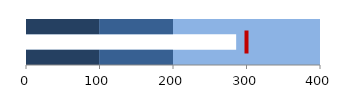
| Category | Series 0 | Series 1 | Series 2 |
|---|---|---|---|
| 2.0 | 0 | 100 | 100 |